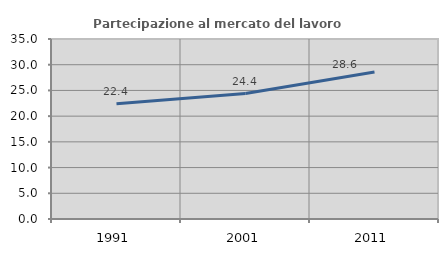
| Category | Partecipazione al mercato del lavoro  femminile |
|---|---|
| 1991.0 | 22.41 |
| 2001.0 | 24.398 |
| 2011.0 | 28.588 |